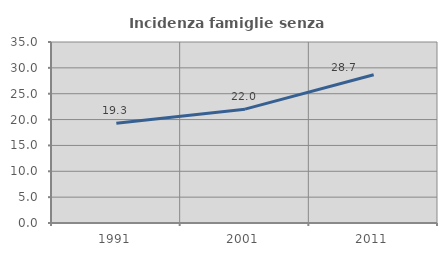
| Category | Incidenza famiglie senza nuclei |
|---|---|
| 1991.0 | 19.285 |
| 2001.0 | 22.013 |
| 2011.0 | 28.675 |